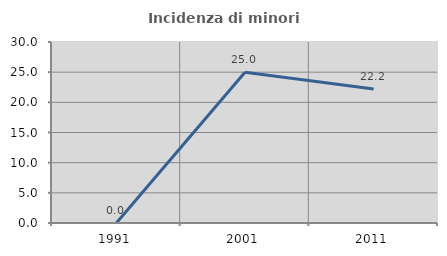
| Category | Incidenza di minori stranieri |
|---|---|
| 1991.0 | 0 |
| 2001.0 | 25 |
| 2011.0 | 22.222 |